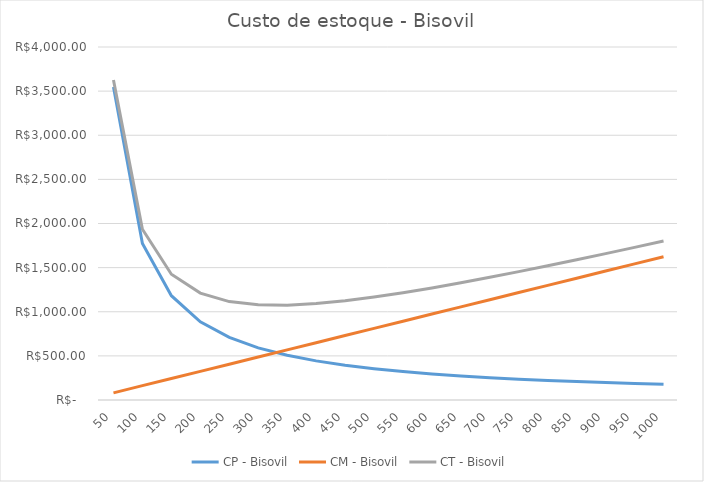
| Category | CP - Bisovil | CM - Bisovil | CT - Bisovil |
|---|---|---|---|
| 50.0 | 3545.767 | 81.2 | 3626.967 |
| 100.0 | 1772.883 | 162.4 | 1935.283 |
| 150.0 | 1181.922 | 243.6 | 1425.522 |
| 200.0 | 886.442 | 324.8 | 1211.242 |
| 250.0 | 709.153 | 406 | 1115.153 |
| 300.0 | 590.961 | 487.2 | 1078.161 |
| 350.0 | 506.538 | 568.4 | 1074.938 |
| 400.0 | 443.221 | 649.6 | 1092.821 |
| 450.0 | 393.974 | 730.8 | 1124.774 |
| 500.0 | 354.577 | 812 | 1166.577 |
| 550.0 | 322.342 | 893.2 | 1215.542 |
| 600.0 | 295.481 | 974.4 | 1269.881 |
| 650.0 | 272.751 | 1055.6 | 1328.351 |
| 700.0 | 253.269 | 1136.8 | 1390.069 |
| 750.0 | 236.384 | 1218 | 1454.384 |
| 800.0 | 221.61 | 1299.2 | 1520.81 |
| 850.0 | 208.575 | 1380.4 | 1588.975 |
| 900.0 | 196.987 | 1461.6 | 1658.587 |
| 950.0 | 186.619 | 1542.8 | 1729.419 |
| 1000.0 | 177.288 | 1624 | 1801.288 |